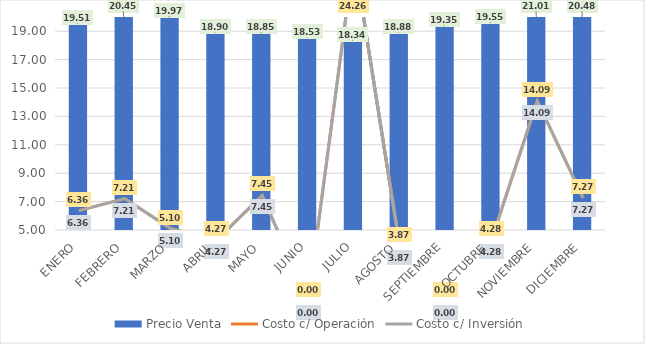
| Category | Precio Venta |
|---|---|
| ENERO | 19.513 |
| FEBRERO | 20.446 |
| MARZO | 19.975 |
| ABRIL | 18.902 |
| MAYO | 18.851 |
| JUNIO | 18.534 |
| JULIO | 18.338 |
| AGOSTO | 18.884 |
| SEPTIEMBRE | 19.352 |
| OCTUBRE | 19.551 |
| NOVIEMBRE | 21.014 |
| DICIEMBRE | 20.477 |